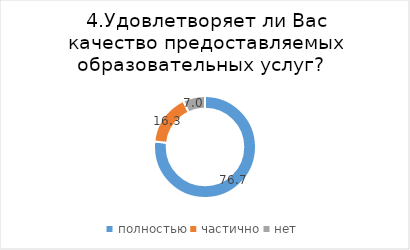
| Category | Series 0 |
|---|---|
| полностью | 76.744 |
| частично | 16.279 |
| нет | 6.977 |